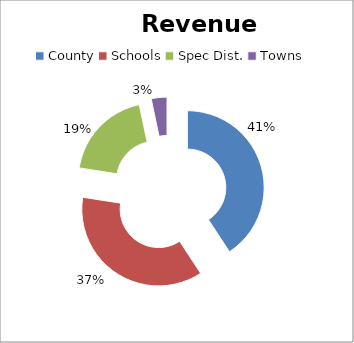
| Category | Series 0 |
|---|---|
| County | 0.408 |
| Schools | 0.367 |
| Spec Dist. | 0.192 |
| Towns | 0.033 |